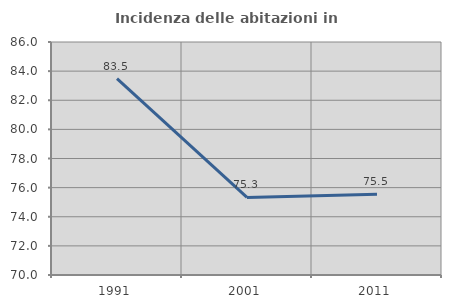
| Category | Incidenza delle abitazioni in proprietà  |
|---|---|
| 1991.0 | 83.482 |
| 2001.0 | 75.325 |
| 2011.0 | 75.547 |